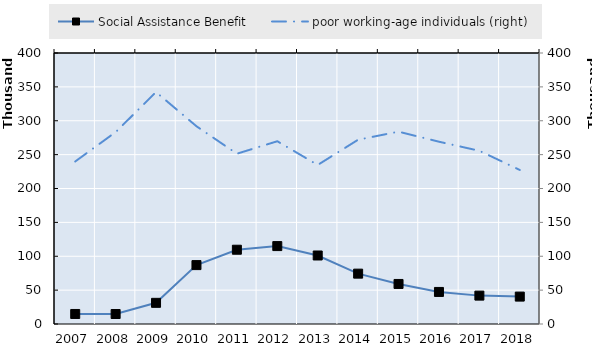
| Category | Social Assistance Benefit  | Series 4 | Series 5 | Series 6 | Series 7 | Series 8 | Series 9 | Series 10 | Series 11 | Series 12 | Series 13 | Series 14 | Series 15 | Series 16 | Series 17 | Series 18 | Series 19 |
|---|---|---|---|---|---|---|---|---|---|---|---|---|---|---|---|---|---|
| 2007.0 | 14797 |  |  |  |  |  |  |  |  |  |  |  |  |  |  |  |  |
| 2008.0 | 14750 |  |  |  |  |  |  |  |  |  |  |  |  |  |  |  |  |
| 2009.0 | 31250 |  |  |  |  |  |  |  |  |  |  |  |  |  |  |  |  |
| 2010.0 | 86934 |  |  |  |  |  |  |  |  |  |  |  |  |  |  |  |  |
| 2011.0 | 109626 |  |  |  |  |  |  |  |  |  |  |  |  |  |  |  |  |
| 2012.0 | 114996 |  |  |  |  |  |  |  |  |  |  |  |  |  |  |  |  |
| 2013.0 | 101111 |  |  |  |  |  |  |  |  |  |  |  |  |  |  |  |  |
| 2014.0 | 74314 |  |  |  |  |  |  |  |  |  |  |  |  |  |  |  |  |
| 2015.0 | 59109 |  |  |  |  |  |  |  |  |  |  |  |  |  |  |  |  |
| 2016.0 | 47315 |  |  |  |  |  |  |  |  |  |  |  |  |  |  |  |  |
| 2017.0 | 41887.167 |  |  |  |  |  |  |  |  |  |  |  |  |  |  |  |  |
| 2018.0 | 40440 |  |  |  |  |  |  |  |  |  |  |  |  |  |  |  |  |